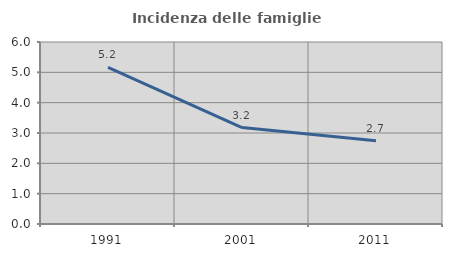
| Category | Incidenza delle famiglie numerose |
|---|---|
| 1991.0 | 5.167 |
| 2001.0 | 3.178 |
| 2011.0 | 2.748 |